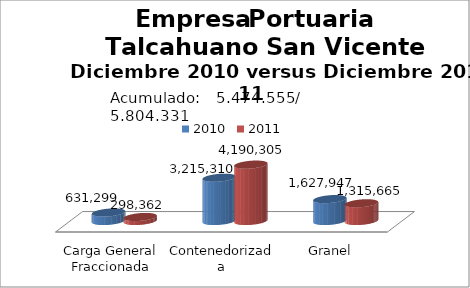
| Category | 2010 | 2011 |
|---|---|---|
| Carga General Fraccionada | 631299.055 | 298361.51 |
| Contenedorizada | 3215309.6 | 4190305 |
| Granel | 1627946.729 | 1315664.92 |